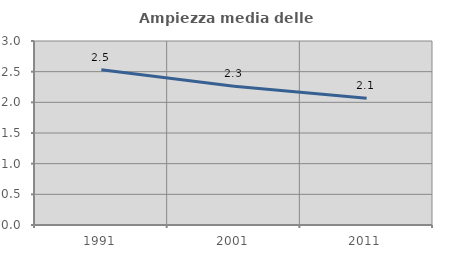
| Category | Ampiezza media delle famiglie |
|---|---|
| 1991.0 | 2.533 |
| 2001.0 | 2.263 |
| 2011.0 | 2.068 |